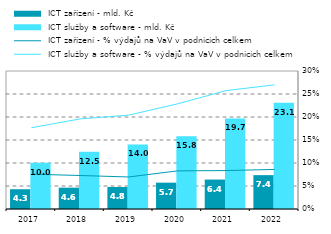
| Category |  ICT zařízení - mld. Kč |  ICT služby a software - mld. Kč |
|---|---|---|
| 2017.0 | 4.301 | 10.029 |
| 2018.0 | 4.637 | 12.464 |
| 2019.0 | 4.789 | 14.041 |
| 2020.0 | 5.725 | 15.792 |
| 2021.0 | 6.397 | 19.699 |
| 2022.0 | 7.361 | 23.108 |